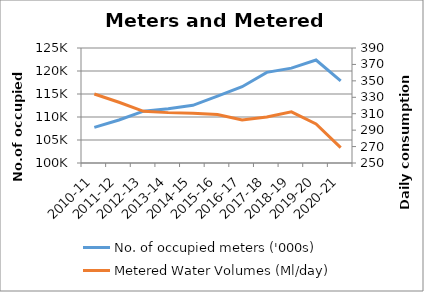
| Category | No. of occupied meters ('000s) |
|---|---|
| 2010-11 | 107.751 |
| 2011-12 | 109.344 |
| 2012-13 | 111.262 |
| 2013-14 | 111.814 |
| 2014-15 | 112.54 |
| 2015-16 | 114.518 |
| 2016-17 | 116.577 |
| 2017-18 | 119.706 |
| 2018-19 | 120.625 |
| 2019-20 | 122.38 |
| 2020-21 | 117.863 |